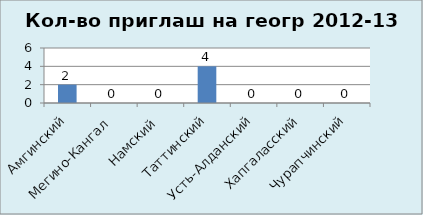
| Category | геог |
|---|---|
| Амгинский | 2 |
| Мегино-Кангал | 0 |
| Намский | 0 |
| Таттинский | 4 |
| Усть-Алданский | 0 |
| Хапгаласский | 0 |
| Чурапчинский | 0 |